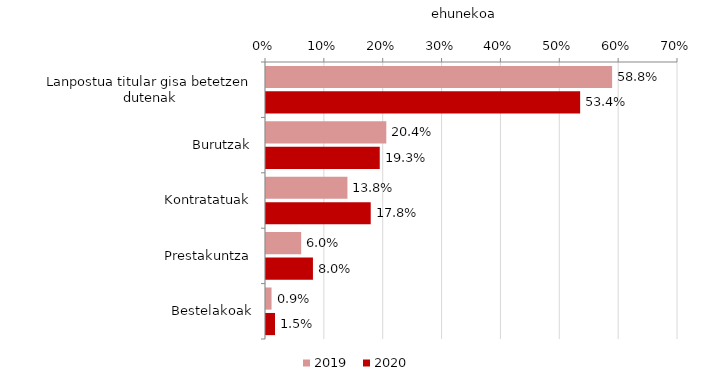
| Category | 2019 | 2020 |
|---|---|---|
| Lanpostua titular gisa betetzen dutenak | 0.588 | 0.534 |
| Burutzak | 0.204 | 0.193 |
| Kontratatuak | 0.138 | 0.178 |
| Prestakuntza | 0.06 | 0.08 |
| Bestelakoak | 0.009 | 0.015 |